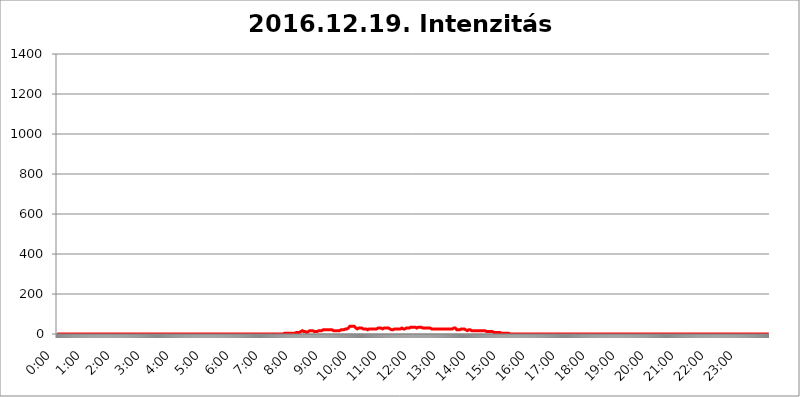
| Category | 2016.12.19. Intenzitás [W/m^2] |
|---|---|
| 0.0 | 0 |
| 0.0006944444444444445 | 0 |
| 0.001388888888888889 | 0 |
| 0.0020833333333333333 | 0 |
| 0.002777777777777778 | 0 |
| 0.003472222222222222 | 0 |
| 0.004166666666666667 | 0 |
| 0.004861111111111111 | 0 |
| 0.005555555555555556 | 0 |
| 0.0062499999999999995 | 0 |
| 0.006944444444444444 | 0 |
| 0.007638888888888889 | 0 |
| 0.008333333333333333 | 0 |
| 0.009027777777777779 | 0 |
| 0.009722222222222222 | 0 |
| 0.010416666666666666 | 0 |
| 0.011111111111111112 | 0 |
| 0.011805555555555555 | 0 |
| 0.012499999999999999 | 0 |
| 0.013194444444444444 | 0 |
| 0.013888888888888888 | 0 |
| 0.014583333333333332 | 0 |
| 0.015277777777777777 | 0 |
| 0.015972222222222224 | 0 |
| 0.016666666666666666 | 0 |
| 0.017361111111111112 | 0 |
| 0.018055555555555557 | 0 |
| 0.01875 | 0 |
| 0.019444444444444445 | 0 |
| 0.02013888888888889 | 0 |
| 0.020833333333333332 | 0 |
| 0.02152777777777778 | 0 |
| 0.022222222222222223 | 0 |
| 0.02291666666666667 | 0 |
| 0.02361111111111111 | 0 |
| 0.024305555555555556 | 0 |
| 0.024999999999999998 | 0 |
| 0.025694444444444447 | 0 |
| 0.02638888888888889 | 0 |
| 0.027083333333333334 | 0 |
| 0.027777777777777776 | 0 |
| 0.02847222222222222 | 0 |
| 0.029166666666666664 | 0 |
| 0.029861111111111113 | 0 |
| 0.030555555555555555 | 0 |
| 0.03125 | 0 |
| 0.03194444444444445 | 0 |
| 0.03263888888888889 | 0 |
| 0.03333333333333333 | 0 |
| 0.034027777777777775 | 0 |
| 0.034722222222222224 | 0 |
| 0.035416666666666666 | 0 |
| 0.036111111111111115 | 0 |
| 0.03680555555555556 | 0 |
| 0.0375 | 0 |
| 0.03819444444444444 | 0 |
| 0.03888888888888889 | 0 |
| 0.03958333333333333 | 0 |
| 0.04027777777777778 | 0 |
| 0.04097222222222222 | 0 |
| 0.041666666666666664 | 0 |
| 0.042361111111111106 | 0 |
| 0.04305555555555556 | 0 |
| 0.043750000000000004 | 0 |
| 0.044444444444444446 | 0 |
| 0.04513888888888889 | 0 |
| 0.04583333333333334 | 0 |
| 0.04652777777777778 | 0 |
| 0.04722222222222222 | 0 |
| 0.04791666666666666 | 0 |
| 0.04861111111111111 | 0 |
| 0.049305555555555554 | 0 |
| 0.049999999999999996 | 0 |
| 0.05069444444444445 | 0 |
| 0.051388888888888894 | 0 |
| 0.052083333333333336 | 0 |
| 0.05277777777777778 | 0 |
| 0.05347222222222222 | 0 |
| 0.05416666666666667 | 0 |
| 0.05486111111111111 | 0 |
| 0.05555555555555555 | 0 |
| 0.05625 | 0 |
| 0.05694444444444444 | 0 |
| 0.057638888888888885 | 0 |
| 0.05833333333333333 | 0 |
| 0.05902777777777778 | 0 |
| 0.059722222222222225 | 0 |
| 0.06041666666666667 | 0 |
| 0.061111111111111116 | 0 |
| 0.06180555555555556 | 0 |
| 0.0625 | 0 |
| 0.06319444444444444 | 0 |
| 0.06388888888888888 | 0 |
| 0.06458333333333334 | 0 |
| 0.06527777777777778 | 0 |
| 0.06597222222222222 | 0 |
| 0.06666666666666667 | 0 |
| 0.06736111111111111 | 0 |
| 0.06805555555555555 | 0 |
| 0.06874999999999999 | 0 |
| 0.06944444444444443 | 0 |
| 0.07013888888888889 | 0 |
| 0.07083333333333333 | 0 |
| 0.07152777777777779 | 0 |
| 0.07222222222222223 | 0 |
| 0.07291666666666667 | 0 |
| 0.07361111111111111 | 0 |
| 0.07430555555555556 | 0 |
| 0.075 | 0 |
| 0.07569444444444444 | 0 |
| 0.0763888888888889 | 0 |
| 0.07708333333333334 | 0 |
| 0.07777777777777778 | 0 |
| 0.07847222222222222 | 0 |
| 0.07916666666666666 | 0 |
| 0.0798611111111111 | 0 |
| 0.08055555555555556 | 0 |
| 0.08125 | 0 |
| 0.08194444444444444 | 0 |
| 0.08263888888888889 | 0 |
| 0.08333333333333333 | 0 |
| 0.08402777777777777 | 0 |
| 0.08472222222222221 | 0 |
| 0.08541666666666665 | 0 |
| 0.08611111111111112 | 0 |
| 0.08680555555555557 | 0 |
| 0.08750000000000001 | 0 |
| 0.08819444444444445 | 0 |
| 0.08888888888888889 | 0 |
| 0.08958333333333333 | 0 |
| 0.09027777777777778 | 0 |
| 0.09097222222222222 | 0 |
| 0.09166666666666667 | 0 |
| 0.09236111111111112 | 0 |
| 0.09305555555555556 | 0 |
| 0.09375 | 0 |
| 0.09444444444444444 | 0 |
| 0.09513888888888888 | 0 |
| 0.09583333333333333 | 0 |
| 0.09652777777777777 | 0 |
| 0.09722222222222222 | 0 |
| 0.09791666666666667 | 0 |
| 0.09861111111111111 | 0 |
| 0.09930555555555555 | 0 |
| 0.09999999999999999 | 0 |
| 0.10069444444444443 | 0 |
| 0.1013888888888889 | 0 |
| 0.10208333333333335 | 0 |
| 0.10277777777777779 | 0 |
| 0.10347222222222223 | 0 |
| 0.10416666666666667 | 0 |
| 0.10486111111111111 | 0 |
| 0.10555555555555556 | 0 |
| 0.10625 | 0 |
| 0.10694444444444444 | 0 |
| 0.1076388888888889 | 0 |
| 0.10833333333333334 | 0 |
| 0.10902777777777778 | 0 |
| 0.10972222222222222 | 0 |
| 0.1111111111111111 | 0 |
| 0.11180555555555556 | 0 |
| 0.11180555555555556 | 0 |
| 0.1125 | 0 |
| 0.11319444444444444 | 0 |
| 0.11388888888888889 | 0 |
| 0.11458333333333333 | 0 |
| 0.11527777777777777 | 0 |
| 0.11597222222222221 | 0 |
| 0.11666666666666665 | 0 |
| 0.1173611111111111 | 0 |
| 0.11805555555555557 | 0 |
| 0.11944444444444445 | 0 |
| 0.12013888888888889 | 0 |
| 0.12083333333333333 | 0 |
| 0.12152777777777778 | 0 |
| 0.12222222222222223 | 0 |
| 0.12291666666666667 | 0 |
| 0.12291666666666667 | 0 |
| 0.12361111111111112 | 0 |
| 0.12430555555555556 | 0 |
| 0.125 | 0 |
| 0.12569444444444444 | 0 |
| 0.12638888888888888 | 0 |
| 0.12708333333333333 | 0 |
| 0.16875 | 0 |
| 0.12847222222222224 | 0 |
| 0.12916666666666668 | 0 |
| 0.12986111111111112 | 0 |
| 0.13055555555555556 | 0 |
| 0.13125 | 0 |
| 0.13194444444444445 | 0 |
| 0.1326388888888889 | 0 |
| 0.13333333333333333 | 0 |
| 0.13402777777777777 | 0 |
| 0.13402777777777777 | 0 |
| 0.13472222222222222 | 0 |
| 0.13541666666666666 | 0 |
| 0.1361111111111111 | 0 |
| 0.13749999999999998 | 0 |
| 0.13819444444444443 | 0 |
| 0.1388888888888889 | 0 |
| 0.13958333333333334 | 0 |
| 0.14027777777777778 | 0 |
| 0.14097222222222222 | 0 |
| 0.14166666666666666 | 0 |
| 0.1423611111111111 | 0 |
| 0.14305555555555557 | 0 |
| 0.14375000000000002 | 0 |
| 0.14444444444444446 | 0 |
| 0.1451388888888889 | 0 |
| 0.1451388888888889 | 0 |
| 0.14652777777777778 | 0 |
| 0.14722222222222223 | 0 |
| 0.14791666666666667 | 0 |
| 0.1486111111111111 | 0 |
| 0.14930555555555555 | 0 |
| 0.15 | 0 |
| 0.15069444444444444 | 0 |
| 0.15138888888888888 | 0 |
| 0.15208333333333332 | 0 |
| 0.15277777777777776 | 0 |
| 0.15347222222222223 | 0 |
| 0.15416666666666667 | 0 |
| 0.15486111111111112 | 0 |
| 0.15555555555555556 | 0 |
| 0.15625 | 0 |
| 0.15694444444444444 | 0 |
| 0.15763888888888888 | 0 |
| 0.15833333333333333 | 0 |
| 0.15902777777777777 | 0 |
| 0.15972222222222224 | 0 |
| 0.16041666666666668 | 0 |
| 0.16111111111111112 | 0 |
| 0.16180555555555556 | 0 |
| 0.1625 | 0 |
| 0.16319444444444445 | 0 |
| 0.1638888888888889 | 0 |
| 0.16458333333333333 | 0 |
| 0.16527777777777777 | 0 |
| 0.16597222222222222 | 0 |
| 0.16666666666666666 | 0 |
| 0.1673611111111111 | 0 |
| 0.16805555555555554 | 0 |
| 0.16874999999999998 | 0 |
| 0.16944444444444443 | 0 |
| 0.17013888888888887 | 0 |
| 0.1708333333333333 | 0 |
| 0.17152777777777775 | 0 |
| 0.17222222222222225 | 0 |
| 0.1729166666666667 | 0 |
| 0.17361111111111113 | 0 |
| 0.17430555555555557 | 0 |
| 0.17500000000000002 | 0 |
| 0.17569444444444446 | 0 |
| 0.1763888888888889 | 0 |
| 0.17708333333333334 | 0 |
| 0.17777777777777778 | 0 |
| 0.17847222222222223 | 0 |
| 0.17916666666666667 | 0 |
| 0.1798611111111111 | 0 |
| 0.18055555555555555 | 0 |
| 0.18125 | 0 |
| 0.18194444444444444 | 0 |
| 0.1826388888888889 | 0 |
| 0.18333333333333335 | 0 |
| 0.1840277777777778 | 0 |
| 0.18472222222222223 | 0 |
| 0.18541666666666667 | 0 |
| 0.18611111111111112 | 0 |
| 0.18680555555555556 | 0 |
| 0.1875 | 0 |
| 0.18819444444444444 | 0 |
| 0.18888888888888888 | 0 |
| 0.18958333333333333 | 0 |
| 0.19027777777777777 | 0 |
| 0.1909722222222222 | 0 |
| 0.19166666666666665 | 0 |
| 0.19236111111111112 | 0 |
| 0.19305555555555554 | 0 |
| 0.19375 | 0 |
| 0.19444444444444445 | 0 |
| 0.1951388888888889 | 0 |
| 0.19583333333333333 | 0 |
| 0.19652777777777777 | 0 |
| 0.19722222222222222 | 0 |
| 0.19791666666666666 | 0 |
| 0.1986111111111111 | 0 |
| 0.19930555555555554 | 0 |
| 0.19999999999999998 | 0 |
| 0.20069444444444443 | 0 |
| 0.20138888888888887 | 0 |
| 0.2020833333333333 | 0 |
| 0.2027777777777778 | 0 |
| 0.2034722222222222 | 0 |
| 0.2041666666666667 | 0 |
| 0.20486111111111113 | 0 |
| 0.20555555555555557 | 0 |
| 0.20625000000000002 | 0 |
| 0.20694444444444446 | 0 |
| 0.2076388888888889 | 0 |
| 0.20833333333333334 | 0 |
| 0.20902777777777778 | 0 |
| 0.20972222222222223 | 0 |
| 0.21041666666666667 | 0 |
| 0.2111111111111111 | 0 |
| 0.21180555555555555 | 0 |
| 0.2125 | 0 |
| 0.21319444444444444 | 0 |
| 0.2138888888888889 | 0 |
| 0.21458333333333335 | 0 |
| 0.2152777777777778 | 0 |
| 0.21597222222222223 | 0 |
| 0.21666666666666667 | 0 |
| 0.21736111111111112 | 0 |
| 0.21805555555555556 | 0 |
| 0.21875 | 0 |
| 0.21944444444444444 | 0 |
| 0.22013888888888888 | 0 |
| 0.22083333333333333 | 0 |
| 0.22152777777777777 | 0 |
| 0.2222222222222222 | 0 |
| 0.22291666666666665 | 0 |
| 0.2236111111111111 | 0 |
| 0.22430555555555556 | 0 |
| 0.225 | 0 |
| 0.22569444444444445 | 0 |
| 0.2263888888888889 | 0 |
| 0.22708333333333333 | 0 |
| 0.22777777777777777 | 0 |
| 0.22847222222222222 | 0 |
| 0.22916666666666666 | 0 |
| 0.2298611111111111 | 0 |
| 0.23055555555555554 | 0 |
| 0.23124999999999998 | 0 |
| 0.23194444444444443 | 0 |
| 0.23263888888888887 | 0 |
| 0.2333333333333333 | 0 |
| 0.2340277777777778 | 0 |
| 0.2347222222222222 | 0 |
| 0.2354166666666667 | 0 |
| 0.23611111111111113 | 0 |
| 0.23680555555555557 | 0 |
| 0.23750000000000002 | 0 |
| 0.23819444444444446 | 0 |
| 0.2388888888888889 | 0 |
| 0.23958333333333334 | 0 |
| 0.24027777777777778 | 0 |
| 0.24097222222222223 | 0 |
| 0.24166666666666667 | 0 |
| 0.2423611111111111 | 0 |
| 0.24305555555555555 | 0 |
| 0.24375 | 0 |
| 0.24444444444444446 | 0 |
| 0.24513888888888888 | 0 |
| 0.24583333333333335 | 0 |
| 0.2465277777777778 | 0 |
| 0.24722222222222223 | 0 |
| 0.24791666666666667 | 0 |
| 0.24861111111111112 | 0 |
| 0.24930555555555556 | 0 |
| 0.25 | 0 |
| 0.25069444444444444 | 0 |
| 0.2513888888888889 | 0 |
| 0.2520833333333333 | 0 |
| 0.25277777777777777 | 0 |
| 0.2534722222222222 | 0 |
| 0.25416666666666665 | 0 |
| 0.2548611111111111 | 0 |
| 0.2555555555555556 | 0 |
| 0.25625000000000003 | 0 |
| 0.2569444444444445 | 0 |
| 0.2576388888888889 | 0 |
| 0.25833333333333336 | 0 |
| 0.2590277777777778 | 0 |
| 0.25972222222222224 | 0 |
| 0.2604166666666667 | 0 |
| 0.2611111111111111 | 0 |
| 0.26180555555555557 | 0 |
| 0.2625 | 0 |
| 0.26319444444444445 | 0 |
| 0.2638888888888889 | 0 |
| 0.26458333333333334 | 0 |
| 0.2652777777777778 | 0 |
| 0.2659722222222222 | 0 |
| 0.26666666666666666 | 0 |
| 0.2673611111111111 | 0 |
| 0.26805555555555555 | 0 |
| 0.26875 | 0 |
| 0.26944444444444443 | 0 |
| 0.2701388888888889 | 0 |
| 0.2708333333333333 | 0 |
| 0.27152777777777776 | 0 |
| 0.2722222222222222 | 0 |
| 0.27291666666666664 | 0 |
| 0.2736111111111111 | 0 |
| 0.2743055555555555 | 0 |
| 0.27499999999999997 | 0 |
| 0.27569444444444446 | 0 |
| 0.27638888888888885 | 0 |
| 0.27708333333333335 | 0 |
| 0.2777777777777778 | 0 |
| 0.27847222222222223 | 0 |
| 0.2791666666666667 | 0 |
| 0.2798611111111111 | 0 |
| 0.28055555555555556 | 0 |
| 0.28125 | 0 |
| 0.28194444444444444 | 0 |
| 0.2826388888888889 | 0 |
| 0.2833333333333333 | 0 |
| 0.28402777777777777 | 0 |
| 0.2847222222222222 | 0 |
| 0.28541666666666665 | 0 |
| 0.28611111111111115 | 0 |
| 0.28680555555555554 | 0 |
| 0.28750000000000003 | 0 |
| 0.2881944444444445 | 0 |
| 0.2888888888888889 | 0 |
| 0.28958333333333336 | 0 |
| 0.2902777777777778 | 0 |
| 0.29097222222222224 | 0 |
| 0.2916666666666667 | 0 |
| 0.2923611111111111 | 0 |
| 0.29305555555555557 | 0 |
| 0.29375 | 0 |
| 0.29444444444444445 | 0 |
| 0.2951388888888889 | 0 |
| 0.29583333333333334 | 0 |
| 0.2965277777777778 | 0 |
| 0.2972222222222222 | 0 |
| 0.29791666666666666 | 0 |
| 0.2986111111111111 | 0 |
| 0.29930555555555555 | 0 |
| 0.3 | 0 |
| 0.30069444444444443 | 0 |
| 0.3013888888888889 | 0 |
| 0.3020833333333333 | 0 |
| 0.30277777777777776 | 0 |
| 0.3034722222222222 | 0 |
| 0.30416666666666664 | 0 |
| 0.3048611111111111 | 0 |
| 0.3055555555555555 | 0 |
| 0.30624999999999997 | 0 |
| 0.3069444444444444 | 0 |
| 0.3076388888888889 | 0 |
| 0.30833333333333335 | 0 |
| 0.3090277777777778 | 0 |
| 0.30972222222222223 | 0 |
| 0.3104166666666667 | 0 |
| 0.3111111111111111 | 0 |
| 0.31180555555555556 | 0 |
| 0.3125 | 0 |
| 0.31319444444444444 | 0 |
| 0.3138888888888889 | 0 |
| 0.3145833333333333 | 0 |
| 0.31527777777777777 | 0 |
| 0.3159722222222222 | 0 |
| 0.31666666666666665 | 0 |
| 0.31736111111111115 | 0 |
| 0.31805555555555554 | 0 |
| 0.31875000000000003 | 3.525 |
| 0.3194444444444445 | 3.525 |
| 0.3201388888888889 | 3.525 |
| 0.32083333333333336 | 3.525 |
| 0.3215277777777778 | 3.525 |
| 0.32222222222222224 | 3.525 |
| 0.3229166666666667 | 3.525 |
| 0.3236111111111111 | 3.525 |
| 0.32430555555555557 | 3.525 |
| 0.325 | 3.525 |
| 0.32569444444444445 | 3.525 |
| 0.3263888888888889 | 3.525 |
| 0.32708333333333334 | 3.525 |
| 0.3277777777777778 | 3.525 |
| 0.3284722222222222 | 3.525 |
| 0.32916666666666666 | 3.525 |
| 0.3298611111111111 | 3.525 |
| 0.33055555555555555 | 3.525 |
| 0.33125 | 3.525 |
| 0.33194444444444443 | 3.525 |
| 0.3326388888888889 | 3.525 |
| 0.3333333333333333 | 3.525 |
| 0.3340277777777778 | 3.525 |
| 0.3347222222222222 | 3.525 |
| 0.3354166666666667 | 7.887 |
| 0.3361111111111111 | 7.887 |
| 0.3368055555555556 | 7.887 |
| 0.33749999999999997 | 7.887 |
| 0.33819444444444446 | 7.887 |
| 0.33888888888888885 | 7.887 |
| 0.33958333333333335 | 7.887 |
| 0.34027777777777773 | 7.887 |
| 0.34097222222222223 | 12.257 |
| 0.3416666666666666 | 12.257 |
| 0.3423611111111111 | 12.257 |
| 0.3430555555555555 | 12.257 |
| 0.34375 | 16.636 |
| 0.3444444444444445 | 12.257 |
| 0.3451388888888889 | 12.257 |
| 0.3458333333333334 | 12.257 |
| 0.34652777777777777 | 12.257 |
| 0.34722222222222227 | 12.257 |
| 0.34791666666666665 | 12.257 |
| 0.34861111111111115 | 12.257 |
| 0.34930555555555554 | 12.257 |
| 0.35000000000000003 | 7.887 |
| 0.3506944444444444 | 12.257 |
| 0.3513888888888889 | 12.257 |
| 0.3520833333333333 | 12.257 |
| 0.3527777777777778 | 12.257 |
| 0.3534722222222222 | 16.636 |
| 0.3541666666666667 | 16.636 |
| 0.3548611111111111 | 16.636 |
| 0.35555555555555557 | 16.636 |
| 0.35625 | 16.636 |
| 0.35694444444444445 | 16.636 |
| 0.3576388888888889 | 16.636 |
| 0.35833333333333334 | 16.636 |
| 0.3590277777777778 | 12.257 |
| 0.3597222222222222 | 12.257 |
| 0.36041666666666666 | 12.257 |
| 0.3611111111111111 | 12.257 |
| 0.36180555555555555 | 12.257 |
| 0.3625 | 12.257 |
| 0.36319444444444443 | 12.257 |
| 0.3638888888888889 | 12.257 |
| 0.3645833333333333 | 12.257 |
| 0.3652777777777778 | 12.257 |
| 0.3659722222222222 | 12.257 |
| 0.3666666666666667 | 16.636 |
| 0.3673611111111111 | 16.636 |
| 0.3680555555555556 | 16.636 |
| 0.36874999999999997 | 16.636 |
| 0.36944444444444446 | 16.636 |
| 0.37013888888888885 | 16.636 |
| 0.37083333333333335 | 16.636 |
| 0.37152777777777773 | 16.636 |
| 0.37222222222222223 | 21.024 |
| 0.3729166666666666 | 21.024 |
| 0.3736111111111111 | 16.636 |
| 0.3743055555555555 | 21.024 |
| 0.375 | 21.024 |
| 0.3756944444444445 | 21.024 |
| 0.3763888888888889 | 21.024 |
| 0.3770833333333334 | 21.024 |
| 0.37777777777777777 | 21.024 |
| 0.37847222222222227 | 21.024 |
| 0.37916666666666665 | 21.024 |
| 0.37986111111111115 | 21.024 |
| 0.38055555555555554 | 21.024 |
| 0.38125000000000003 | 21.024 |
| 0.3819444444444444 | 21.024 |
| 0.3826388888888889 | 21.024 |
| 0.3833333333333333 | 21.024 |
| 0.3840277777777778 | 21.024 |
| 0.3847222222222222 | 21.024 |
| 0.3854166666666667 | 21.024 |
| 0.3861111111111111 | 21.024 |
| 0.38680555555555557 | 16.636 |
| 0.3875 | 16.636 |
| 0.38819444444444445 | 16.636 |
| 0.3888888888888889 | 16.636 |
| 0.38958333333333334 | 16.636 |
| 0.3902777777777778 | 21.024 |
| 0.3909722222222222 | 21.024 |
| 0.39166666666666666 | 16.636 |
| 0.3923611111111111 | 16.636 |
| 0.39305555555555555 | 16.636 |
| 0.39375 | 16.636 |
| 0.39444444444444443 | 16.636 |
| 0.3951388888888889 | 16.636 |
| 0.3958333333333333 | 16.636 |
| 0.3965277777777778 | 16.636 |
| 0.3972222222222222 | 21.024 |
| 0.3979166666666667 | 21.024 |
| 0.3986111111111111 | 21.024 |
| 0.3993055555555556 | 21.024 |
| 0.39999999999999997 | 21.024 |
| 0.40069444444444446 | 21.024 |
| 0.40138888888888885 | 21.024 |
| 0.40208333333333335 | 21.024 |
| 0.40277777777777773 | 21.024 |
| 0.40347222222222223 | 25.419 |
| 0.4041666666666666 | 25.419 |
| 0.4048611111111111 | 25.419 |
| 0.4055555555555555 | 25.419 |
| 0.40625 | 25.419 |
| 0.4069444444444445 | 25.419 |
| 0.4076388888888889 | 29.823 |
| 0.4083333333333334 | 29.823 |
| 0.40902777777777777 | 34.234 |
| 0.40972222222222227 | 34.234 |
| 0.41041666666666665 | 38.653 |
| 0.41111111111111115 | 38.653 |
| 0.41180555555555554 | 38.653 |
| 0.41250000000000003 | 38.653 |
| 0.4131944444444444 | 38.653 |
| 0.4138888888888889 | 38.653 |
| 0.4145833333333333 | 38.653 |
| 0.4152777777777778 | 38.653 |
| 0.4159722222222222 | 38.653 |
| 0.4166666666666667 | 38.653 |
| 0.4173611111111111 | 34.234 |
| 0.41805555555555557 | 34.234 |
| 0.41875 | 29.823 |
| 0.41944444444444445 | 29.823 |
| 0.4201388888888889 | 29.823 |
| 0.42083333333333334 | 25.419 |
| 0.4215277777777778 | 29.823 |
| 0.4222222222222222 | 29.823 |
| 0.42291666666666666 | 29.823 |
| 0.4236111111111111 | 29.823 |
| 0.42430555555555555 | 29.823 |
| 0.425 | 29.823 |
| 0.42569444444444443 | 29.823 |
| 0.4263888888888889 | 29.823 |
| 0.4270833333333333 | 29.823 |
| 0.4277777777777778 | 29.823 |
| 0.4284722222222222 | 25.419 |
| 0.4291666666666667 | 25.419 |
| 0.4298611111111111 | 25.419 |
| 0.4305555555555556 | 25.419 |
| 0.43124999999999997 | 25.419 |
| 0.43194444444444446 | 25.419 |
| 0.43263888888888885 | 25.419 |
| 0.43333333333333335 | 25.419 |
| 0.43402777777777773 | 25.419 |
| 0.43472222222222223 | 21.024 |
| 0.4354166666666666 | 21.024 |
| 0.4361111111111111 | 21.024 |
| 0.4368055555555555 | 25.419 |
| 0.4375 | 25.419 |
| 0.4381944444444445 | 25.419 |
| 0.4388888888888889 | 25.419 |
| 0.4395833333333334 | 25.419 |
| 0.44027777777777777 | 25.419 |
| 0.44097222222222227 | 25.419 |
| 0.44166666666666665 | 25.419 |
| 0.44236111111111115 | 25.419 |
| 0.44305555555555554 | 25.419 |
| 0.44375000000000003 | 25.419 |
| 0.4444444444444444 | 25.419 |
| 0.4451388888888889 | 25.419 |
| 0.4458333333333333 | 25.419 |
| 0.4465277777777778 | 25.419 |
| 0.4472222222222222 | 25.419 |
| 0.4479166666666667 | 25.419 |
| 0.4486111111111111 | 25.419 |
| 0.44930555555555557 | 29.823 |
| 0.45 | 29.823 |
| 0.45069444444444445 | 25.419 |
| 0.4513888888888889 | 29.823 |
| 0.45208333333333334 | 29.823 |
| 0.4527777777777778 | 29.823 |
| 0.4534722222222222 | 29.823 |
| 0.45416666666666666 | 29.823 |
| 0.4548611111111111 | 29.823 |
| 0.45555555555555555 | 25.419 |
| 0.45625 | 25.419 |
| 0.45694444444444443 | 25.419 |
| 0.4576388888888889 | 25.419 |
| 0.4583333333333333 | 29.823 |
| 0.4590277777777778 | 29.823 |
| 0.4597222222222222 | 29.823 |
| 0.4604166666666667 | 29.823 |
| 0.4611111111111111 | 34.234 |
| 0.4618055555555556 | 29.823 |
| 0.46249999999999997 | 29.823 |
| 0.46319444444444446 | 29.823 |
| 0.46388888888888885 | 29.823 |
| 0.46458333333333335 | 29.823 |
| 0.46527777777777773 | 25.419 |
| 0.46597222222222223 | 25.419 |
| 0.4666666666666666 | 25.419 |
| 0.4673611111111111 | 25.419 |
| 0.4680555555555555 | 25.419 |
| 0.46875 | 21.024 |
| 0.4694444444444445 | 25.419 |
| 0.4701388888888889 | 25.419 |
| 0.4708333333333334 | 21.024 |
| 0.47152777777777777 | 25.419 |
| 0.47222222222222227 | 25.419 |
| 0.47291666666666665 | 25.419 |
| 0.47361111111111115 | 25.419 |
| 0.47430555555555554 | 25.419 |
| 0.47500000000000003 | 25.419 |
| 0.4756944444444444 | 25.419 |
| 0.4763888888888889 | 25.419 |
| 0.4770833333333333 | 25.419 |
| 0.4777777777777778 | 25.419 |
| 0.4784722222222222 | 25.419 |
| 0.4791666666666667 | 25.419 |
| 0.4798611111111111 | 25.419 |
| 0.48055555555555557 | 25.419 |
| 0.48125 | 25.419 |
| 0.48194444444444445 | 25.419 |
| 0.4826388888888889 | 29.823 |
| 0.48333333333333334 | 29.823 |
| 0.4840277777777778 | 25.419 |
| 0.4847222222222222 | 25.419 |
| 0.48541666666666666 | 25.419 |
| 0.4861111111111111 | 25.419 |
| 0.48680555555555555 | 25.419 |
| 0.4875 | 25.419 |
| 0.48819444444444443 | 25.419 |
| 0.4888888888888889 | 29.823 |
| 0.4895833333333333 | 29.823 |
| 0.4902777777777778 | 29.823 |
| 0.4909722222222222 | 29.823 |
| 0.4916666666666667 | 29.823 |
| 0.4923611111111111 | 29.823 |
| 0.4930555555555556 | 29.823 |
| 0.49374999999999997 | 29.823 |
| 0.49444444444444446 | 34.234 |
| 0.49513888888888885 | 34.234 |
| 0.49583333333333335 | 34.234 |
| 0.49652777777777773 | 34.234 |
| 0.49722222222222223 | 34.234 |
| 0.4979166666666666 | 34.234 |
| 0.4986111111111111 | 38.653 |
| 0.4993055555555555 | 34.234 |
| 0.5 | 34.234 |
| 0.5006944444444444 | 34.234 |
| 0.5013888888888889 | 34.234 |
| 0.5020833333333333 | 34.234 |
| 0.5027777777777778 | 34.234 |
| 0.5034722222222222 | 34.234 |
| 0.5041666666666667 | 29.823 |
| 0.5048611111111111 | 29.823 |
| 0.5055555555555555 | 29.823 |
| 0.50625 | 34.234 |
| 0.5069444444444444 | 34.234 |
| 0.5076388888888889 | 34.234 |
| 0.5083333333333333 | 34.234 |
| 0.5090277777777777 | 29.823 |
| 0.5097222222222222 | 29.823 |
| 0.5104166666666666 | 34.234 |
| 0.5111111111111112 | 34.234 |
| 0.5118055555555555 | 29.823 |
| 0.5125000000000001 | 29.823 |
| 0.5131944444444444 | 29.823 |
| 0.513888888888889 | 29.823 |
| 0.5145833333333333 | 29.823 |
| 0.5152777777777778 | 29.823 |
| 0.5159722222222222 | 29.823 |
| 0.5166666666666667 | 29.823 |
| 0.517361111111111 | 29.823 |
| 0.5180555555555556 | 29.823 |
| 0.5187499999999999 | 29.823 |
| 0.5194444444444445 | 29.823 |
| 0.5201388888888888 | 29.823 |
| 0.5208333333333334 | 29.823 |
| 0.5215277777777778 | 29.823 |
| 0.5222222222222223 | 29.823 |
| 0.5229166666666667 | 29.823 |
| 0.5236111111111111 | 29.823 |
| 0.5243055555555556 | 25.419 |
| 0.525 | 25.419 |
| 0.5256944444444445 | 25.419 |
| 0.5263888888888889 | 25.419 |
| 0.5270833333333333 | 25.419 |
| 0.5277777777777778 | 25.419 |
| 0.5284722222222222 | 25.419 |
| 0.5291666666666667 | 25.419 |
| 0.5298611111111111 | 29.823 |
| 0.5305555555555556 | 29.823 |
| 0.53125 | 25.419 |
| 0.5319444444444444 | 25.419 |
| 0.5326388888888889 | 25.419 |
| 0.5333333333333333 | 25.419 |
| 0.5340277777777778 | 25.419 |
| 0.5347222222222222 | 25.419 |
| 0.5354166666666667 | 25.419 |
| 0.5361111111111111 | 25.419 |
| 0.5368055555555555 | 25.419 |
| 0.5375 | 25.419 |
| 0.5381944444444444 | 25.419 |
| 0.5388888888888889 | 25.419 |
| 0.5395833333333333 | 25.419 |
| 0.5402777777777777 | 25.419 |
| 0.5409722222222222 | 25.419 |
| 0.5416666666666666 | 25.419 |
| 0.5423611111111112 | 25.419 |
| 0.5430555555555555 | 25.419 |
| 0.5437500000000001 | 25.419 |
| 0.5444444444444444 | 25.419 |
| 0.545138888888889 | 25.419 |
| 0.5458333333333333 | 25.419 |
| 0.5465277777777778 | 29.823 |
| 0.5472222222222222 | 29.823 |
| 0.5479166666666667 | 25.419 |
| 0.548611111111111 | 25.419 |
| 0.5493055555555556 | 25.419 |
| 0.5499999999999999 | 25.419 |
| 0.5506944444444445 | 25.419 |
| 0.5513888888888888 | 25.419 |
| 0.5520833333333334 | 25.419 |
| 0.5527777777777778 | 25.419 |
| 0.5534722222222223 | 25.419 |
| 0.5541666666666667 | 25.419 |
| 0.5548611111111111 | 29.823 |
| 0.5555555555555556 | 29.823 |
| 0.55625 | 29.823 |
| 0.5569444444444445 | 29.823 |
| 0.5576388888888889 | 29.823 |
| 0.5583333333333333 | 29.823 |
| 0.5590277777777778 | 25.419 |
| 0.5597222222222222 | 25.419 |
| 0.5604166666666667 | 21.024 |
| 0.5611111111111111 | 21.024 |
| 0.5618055555555556 | 21.024 |
| 0.5625 | 21.024 |
| 0.5631944444444444 | 21.024 |
| 0.5638888888888889 | 21.024 |
| 0.5645833333333333 | 21.024 |
| 0.5652777777777778 | 21.024 |
| 0.5659722222222222 | 25.419 |
| 0.5666666666666667 | 25.419 |
| 0.5673611111111111 | 25.419 |
| 0.5680555555555555 | 25.419 |
| 0.56875 | 25.419 |
| 0.5694444444444444 | 25.419 |
| 0.5701388888888889 | 25.419 |
| 0.5708333333333333 | 25.419 |
| 0.5715277777777777 | 21.024 |
| 0.5722222222222222 | 21.024 |
| 0.5729166666666666 | 21.024 |
| 0.5736111111111112 | 21.024 |
| 0.5743055555555555 | 21.024 |
| 0.5750000000000001 | 16.636 |
| 0.5756944444444444 | 16.636 |
| 0.576388888888889 | 16.636 |
| 0.5770833333333333 | 21.024 |
| 0.5777777777777778 | 21.024 |
| 0.5784722222222222 | 21.024 |
| 0.5791666666666667 | 21.024 |
| 0.579861111111111 | 21.024 |
| 0.5805555555555556 | 21.024 |
| 0.5812499999999999 | 16.636 |
| 0.5819444444444445 | 16.636 |
| 0.5826388888888888 | 16.636 |
| 0.5833333333333334 | 16.636 |
| 0.5840277777777778 | 16.636 |
| 0.5847222222222223 | 16.636 |
| 0.5854166666666667 | 16.636 |
| 0.5861111111111111 | 16.636 |
| 0.5868055555555556 | 16.636 |
| 0.5875 | 16.636 |
| 0.5881944444444445 | 16.636 |
| 0.5888888888888889 | 16.636 |
| 0.5895833333333333 | 16.636 |
| 0.5902777777777778 | 16.636 |
| 0.5909722222222222 | 16.636 |
| 0.5916666666666667 | 16.636 |
| 0.5923611111111111 | 12.257 |
| 0.5930555555555556 | 16.636 |
| 0.59375 | 16.636 |
| 0.5944444444444444 | 16.636 |
| 0.5951388888888889 | 16.636 |
| 0.5958333333333333 | 16.636 |
| 0.5965277777777778 | 16.636 |
| 0.5972222222222222 | 16.636 |
| 0.5979166666666667 | 16.636 |
| 0.5986111111111111 | 16.636 |
| 0.5993055555555555 | 16.636 |
| 0.6 | 16.636 |
| 0.6006944444444444 | 12.257 |
| 0.6013888888888889 | 12.257 |
| 0.6020833333333333 | 12.257 |
| 0.6027777777777777 | 12.257 |
| 0.6034722222222222 | 12.257 |
| 0.6041666666666666 | 12.257 |
| 0.6048611111111112 | 12.257 |
| 0.6055555555555555 | 12.257 |
| 0.6062500000000001 | 12.257 |
| 0.6069444444444444 | 12.257 |
| 0.607638888888889 | 12.257 |
| 0.6083333333333333 | 12.257 |
| 0.6090277777777778 | 12.257 |
| 0.6097222222222222 | 12.257 |
| 0.6104166666666667 | 12.257 |
| 0.611111111111111 | 7.887 |
| 0.6118055555555556 | 7.887 |
| 0.6124999999999999 | 7.887 |
| 0.6131944444444445 | 7.887 |
| 0.6138888888888888 | 7.887 |
| 0.6145833333333334 | 7.887 |
| 0.6152777777777778 | 7.887 |
| 0.6159722222222223 | 7.887 |
| 0.6166666666666667 | 7.887 |
| 0.6173611111111111 | 3.525 |
| 0.6180555555555556 | 7.887 |
| 0.61875 | 7.887 |
| 0.6194444444444445 | 7.887 |
| 0.6201388888888889 | 3.525 |
| 0.6208333333333333 | 7.887 |
| 0.6215277777777778 | 3.525 |
| 0.6222222222222222 | 3.525 |
| 0.6229166666666667 | 3.525 |
| 0.6236111111111111 | 3.525 |
| 0.6243055555555556 | 3.525 |
| 0.625 | 3.525 |
| 0.6256944444444444 | 3.525 |
| 0.6263888888888889 | 3.525 |
| 0.6270833333333333 | 3.525 |
| 0.6277777777777778 | 3.525 |
| 0.6284722222222222 | 3.525 |
| 0.6291666666666667 | 3.525 |
| 0.6298611111111111 | 3.525 |
| 0.6305555555555555 | 3.525 |
| 0.63125 | 3.525 |
| 0.6319444444444444 | 3.525 |
| 0.6326388888888889 | 3.525 |
| 0.6333333333333333 | 3.525 |
| 0.6340277777777777 | 0 |
| 0.6347222222222222 | 3.525 |
| 0.6354166666666666 | 0 |
| 0.6361111111111112 | 0 |
| 0.6368055555555555 | 0 |
| 0.6375000000000001 | 0 |
| 0.6381944444444444 | 0 |
| 0.638888888888889 | 0 |
| 0.6395833333333333 | 0 |
| 0.6402777777777778 | 0 |
| 0.6409722222222222 | 0 |
| 0.6416666666666667 | 0 |
| 0.642361111111111 | 0 |
| 0.6430555555555556 | 0 |
| 0.6437499999999999 | 0 |
| 0.6444444444444445 | 0 |
| 0.6451388888888888 | 0 |
| 0.6458333333333334 | 0 |
| 0.6465277777777778 | 0 |
| 0.6472222222222223 | 0 |
| 0.6479166666666667 | 0 |
| 0.6486111111111111 | 0 |
| 0.6493055555555556 | 0 |
| 0.65 | 0 |
| 0.6506944444444445 | 0 |
| 0.6513888888888889 | 0 |
| 0.6520833333333333 | 0 |
| 0.6527777777777778 | 0 |
| 0.6534722222222222 | 0 |
| 0.6541666666666667 | 0 |
| 0.6548611111111111 | 0 |
| 0.6555555555555556 | 0 |
| 0.65625 | 0 |
| 0.6569444444444444 | 0 |
| 0.6576388888888889 | 0 |
| 0.6583333333333333 | 0 |
| 0.6590277777777778 | 0 |
| 0.6597222222222222 | 0 |
| 0.6604166666666667 | 0 |
| 0.6611111111111111 | 0 |
| 0.6618055555555555 | 0 |
| 0.6625 | 0 |
| 0.6631944444444444 | 0 |
| 0.6638888888888889 | 0 |
| 0.6645833333333333 | 0 |
| 0.6652777777777777 | 0 |
| 0.6659722222222222 | 0 |
| 0.6666666666666666 | 0 |
| 0.6673611111111111 | 0 |
| 0.6680555555555556 | 0 |
| 0.6687500000000001 | 0 |
| 0.6694444444444444 | 0 |
| 0.6701388888888888 | 0 |
| 0.6708333333333334 | 0 |
| 0.6715277777777778 | 0 |
| 0.6722222222222222 | 0 |
| 0.6729166666666666 | 0 |
| 0.6736111111111112 | 0 |
| 0.6743055555555556 | 0 |
| 0.6749999999999999 | 0 |
| 0.6756944444444444 | 0 |
| 0.6763888888888889 | 0 |
| 0.6770833333333334 | 0 |
| 0.6777777777777777 | 0 |
| 0.6784722222222223 | 0 |
| 0.6791666666666667 | 0 |
| 0.6798611111111111 | 0 |
| 0.6805555555555555 | 0 |
| 0.68125 | 0 |
| 0.6819444444444445 | 0 |
| 0.6826388888888889 | 0 |
| 0.6833333333333332 | 0 |
| 0.6840277777777778 | 0 |
| 0.6847222222222222 | 0 |
| 0.6854166666666667 | 0 |
| 0.686111111111111 | 0 |
| 0.6868055555555556 | 0 |
| 0.6875 | 0 |
| 0.6881944444444444 | 0 |
| 0.688888888888889 | 0 |
| 0.6895833333333333 | 0 |
| 0.6902777777777778 | 0 |
| 0.6909722222222222 | 0 |
| 0.6916666666666668 | 0 |
| 0.6923611111111111 | 0 |
| 0.6930555555555555 | 0 |
| 0.69375 | 0 |
| 0.6944444444444445 | 0 |
| 0.6951388888888889 | 0 |
| 0.6958333333333333 | 0 |
| 0.6965277777777777 | 0 |
| 0.6972222222222223 | 0 |
| 0.6979166666666666 | 0 |
| 0.6986111111111111 | 0 |
| 0.6993055555555556 | 0 |
| 0.7000000000000001 | 0 |
| 0.7006944444444444 | 0 |
| 0.7013888888888888 | 0 |
| 0.7020833333333334 | 0 |
| 0.7027777777777778 | 0 |
| 0.7034722222222222 | 0 |
| 0.7041666666666666 | 0 |
| 0.7048611111111112 | 0 |
| 0.7055555555555556 | 0 |
| 0.7062499999999999 | 0 |
| 0.7069444444444444 | 0 |
| 0.7076388888888889 | 0 |
| 0.7083333333333334 | 0 |
| 0.7090277777777777 | 0 |
| 0.7097222222222223 | 0 |
| 0.7104166666666667 | 0 |
| 0.7111111111111111 | 0 |
| 0.7118055555555555 | 0 |
| 0.7125 | 0 |
| 0.7131944444444445 | 0 |
| 0.7138888888888889 | 0 |
| 0.7145833333333332 | 0 |
| 0.7152777777777778 | 0 |
| 0.7159722222222222 | 0 |
| 0.7166666666666667 | 0 |
| 0.717361111111111 | 0 |
| 0.7180555555555556 | 0 |
| 0.71875 | 0 |
| 0.7194444444444444 | 0 |
| 0.720138888888889 | 0 |
| 0.7208333333333333 | 0 |
| 0.7215277777777778 | 0 |
| 0.7222222222222222 | 0 |
| 0.7229166666666668 | 0 |
| 0.7236111111111111 | 0 |
| 0.7243055555555555 | 0 |
| 0.725 | 0 |
| 0.7256944444444445 | 0 |
| 0.7263888888888889 | 0 |
| 0.7270833333333333 | 0 |
| 0.7277777777777777 | 0 |
| 0.7284722222222223 | 0 |
| 0.7291666666666666 | 0 |
| 0.7298611111111111 | 0 |
| 0.7305555555555556 | 0 |
| 0.7312500000000001 | 0 |
| 0.7319444444444444 | 0 |
| 0.7326388888888888 | 0 |
| 0.7333333333333334 | 0 |
| 0.7340277777777778 | 0 |
| 0.7347222222222222 | 0 |
| 0.7354166666666666 | 0 |
| 0.7361111111111112 | 0 |
| 0.7368055555555556 | 0 |
| 0.7374999999999999 | 0 |
| 0.7381944444444444 | 0 |
| 0.7388888888888889 | 0 |
| 0.7395833333333334 | 0 |
| 0.7402777777777777 | 0 |
| 0.7409722222222223 | 0 |
| 0.7416666666666667 | 0 |
| 0.7423611111111111 | 0 |
| 0.7430555555555555 | 0 |
| 0.74375 | 0 |
| 0.7444444444444445 | 0 |
| 0.7451388888888889 | 0 |
| 0.7458333333333332 | 0 |
| 0.7465277777777778 | 0 |
| 0.7472222222222222 | 0 |
| 0.7479166666666667 | 0 |
| 0.748611111111111 | 0 |
| 0.7493055555555556 | 0 |
| 0.75 | 0 |
| 0.7506944444444444 | 0 |
| 0.751388888888889 | 0 |
| 0.7520833333333333 | 0 |
| 0.7527777777777778 | 0 |
| 0.7534722222222222 | 0 |
| 0.7541666666666668 | 0 |
| 0.7548611111111111 | 0 |
| 0.7555555555555555 | 0 |
| 0.75625 | 0 |
| 0.7569444444444445 | 0 |
| 0.7576388888888889 | 0 |
| 0.7583333333333333 | 0 |
| 0.7590277777777777 | 0 |
| 0.7597222222222223 | 0 |
| 0.7604166666666666 | 0 |
| 0.7611111111111111 | 0 |
| 0.7618055555555556 | 0 |
| 0.7625000000000001 | 0 |
| 0.7631944444444444 | 0 |
| 0.7638888888888888 | 0 |
| 0.7645833333333334 | 0 |
| 0.7652777777777778 | 0 |
| 0.7659722222222222 | 0 |
| 0.7666666666666666 | 0 |
| 0.7673611111111112 | 0 |
| 0.7680555555555556 | 0 |
| 0.7687499999999999 | 0 |
| 0.7694444444444444 | 0 |
| 0.7701388888888889 | 0 |
| 0.7708333333333334 | 0 |
| 0.7715277777777777 | 0 |
| 0.7722222222222223 | 0 |
| 0.7729166666666667 | 0 |
| 0.7736111111111111 | 0 |
| 0.7743055555555555 | 0 |
| 0.775 | 0 |
| 0.7756944444444445 | 0 |
| 0.7763888888888889 | 0 |
| 0.7770833333333332 | 0 |
| 0.7777777777777778 | 0 |
| 0.7784722222222222 | 0 |
| 0.7791666666666667 | 0 |
| 0.779861111111111 | 0 |
| 0.7805555555555556 | 0 |
| 0.78125 | 0 |
| 0.7819444444444444 | 0 |
| 0.782638888888889 | 0 |
| 0.7833333333333333 | 0 |
| 0.7840277777777778 | 0 |
| 0.7847222222222222 | 0 |
| 0.7854166666666668 | 0 |
| 0.7861111111111111 | 0 |
| 0.7868055555555555 | 0 |
| 0.7875 | 0 |
| 0.7881944444444445 | 0 |
| 0.7888888888888889 | 0 |
| 0.7895833333333333 | 0 |
| 0.7902777777777777 | 0 |
| 0.7909722222222223 | 0 |
| 0.7916666666666666 | 0 |
| 0.7923611111111111 | 0 |
| 0.7930555555555556 | 0 |
| 0.7937500000000001 | 0 |
| 0.7944444444444444 | 0 |
| 0.7951388888888888 | 0 |
| 0.7958333333333334 | 0 |
| 0.7965277777777778 | 0 |
| 0.7972222222222222 | 0 |
| 0.7979166666666666 | 0 |
| 0.7986111111111112 | 0 |
| 0.7993055555555556 | 0 |
| 0.7999999999999999 | 0 |
| 0.8006944444444444 | 0 |
| 0.8013888888888889 | 0 |
| 0.8020833333333334 | 0 |
| 0.8027777777777777 | 0 |
| 0.8034722222222223 | 0 |
| 0.8041666666666667 | 0 |
| 0.8048611111111111 | 0 |
| 0.8055555555555555 | 0 |
| 0.80625 | 0 |
| 0.8069444444444445 | 0 |
| 0.8076388888888889 | 0 |
| 0.8083333333333332 | 0 |
| 0.8090277777777778 | 0 |
| 0.8097222222222222 | 0 |
| 0.8104166666666667 | 0 |
| 0.811111111111111 | 0 |
| 0.8118055555555556 | 0 |
| 0.8125 | 0 |
| 0.8131944444444444 | 0 |
| 0.813888888888889 | 0 |
| 0.8145833333333333 | 0 |
| 0.8152777777777778 | 0 |
| 0.8159722222222222 | 0 |
| 0.8166666666666668 | 0 |
| 0.8173611111111111 | 0 |
| 0.8180555555555555 | 0 |
| 0.81875 | 0 |
| 0.8194444444444445 | 0 |
| 0.8201388888888889 | 0 |
| 0.8208333333333333 | 0 |
| 0.8215277777777777 | 0 |
| 0.8222222222222223 | 0 |
| 0.8229166666666666 | 0 |
| 0.8236111111111111 | 0 |
| 0.8243055555555556 | 0 |
| 0.8250000000000001 | 0 |
| 0.8256944444444444 | 0 |
| 0.8263888888888888 | 0 |
| 0.8270833333333334 | 0 |
| 0.8277777777777778 | 0 |
| 0.8284722222222222 | 0 |
| 0.8291666666666666 | 0 |
| 0.8298611111111112 | 0 |
| 0.8305555555555556 | 0 |
| 0.8312499999999999 | 0 |
| 0.8319444444444444 | 0 |
| 0.8326388888888889 | 0 |
| 0.8333333333333334 | 0 |
| 0.8340277777777777 | 0 |
| 0.8347222222222223 | 0 |
| 0.8354166666666667 | 0 |
| 0.8361111111111111 | 0 |
| 0.8368055555555555 | 0 |
| 0.8375 | 0 |
| 0.8381944444444445 | 0 |
| 0.8388888888888889 | 0 |
| 0.8395833333333332 | 0 |
| 0.8402777777777778 | 0 |
| 0.8409722222222222 | 0 |
| 0.8416666666666667 | 0 |
| 0.842361111111111 | 0 |
| 0.8430555555555556 | 0 |
| 0.84375 | 0 |
| 0.8444444444444444 | 0 |
| 0.845138888888889 | 0 |
| 0.8458333333333333 | 0 |
| 0.8465277777777778 | 0 |
| 0.8472222222222222 | 0 |
| 0.8479166666666668 | 0 |
| 0.8486111111111111 | 0 |
| 0.8493055555555555 | 0 |
| 0.85 | 0 |
| 0.8506944444444445 | 0 |
| 0.8513888888888889 | 0 |
| 0.8520833333333333 | 0 |
| 0.8527777777777777 | 0 |
| 0.8534722222222223 | 0 |
| 0.8541666666666666 | 0 |
| 0.8548611111111111 | 0 |
| 0.8555555555555556 | 0 |
| 0.8562500000000001 | 0 |
| 0.8569444444444444 | 0 |
| 0.8576388888888888 | 0 |
| 0.8583333333333334 | 0 |
| 0.8590277777777778 | 0 |
| 0.8597222222222222 | 0 |
| 0.8604166666666666 | 0 |
| 0.8611111111111112 | 0 |
| 0.8618055555555556 | 0 |
| 0.8624999999999999 | 0 |
| 0.8631944444444444 | 0 |
| 0.8638888888888889 | 0 |
| 0.8645833333333334 | 0 |
| 0.8652777777777777 | 0 |
| 0.8659722222222223 | 0 |
| 0.8666666666666667 | 0 |
| 0.8673611111111111 | 0 |
| 0.8680555555555555 | 0 |
| 0.86875 | 0 |
| 0.8694444444444445 | 0 |
| 0.8701388888888889 | 0 |
| 0.8708333333333332 | 0 |
| 0.8715277777777778 | 0 |
| 0.8722222222222222 | 0 |
| 0.8729166666666667 | 0 |
| 0.873611111111111 | 0 |
| 0.8743055555555556 | 0 |
| 0.875 | 0 |
| 0.8756944444444444 | 0 |
| 0.876388888888889 | 0 |
| 0.8770833333333333 | 0 |
| 0.8777777777777778 | 0 |
| 0.8784722222222222 | 0 |
| 0.8791666666666668 | 0 |
| 0.8798611111111111 | 0 |
| 0.8805555555555555 | 0 |
| 0.88125 | 0 |
| 0.8819444444444445 | 0 |
| 0.8826388888888889 | 0 |
| 0.8833333333333333 | 0 |
| 0.8840277777777777 | 0 |
| 0.8847222222222223 | 0 |
| 0.8854166666666666 | 0 |
| 0.8861111111111111 | 0 |
| 0.8868055555555556 | 0 |
| 0.8875000000000001 | 0 |
| 0.8881944444444444 | 0 |
| 0.8888888888888888 | 0 |
| 0.8895833333333334 | 0 |
| 0.8902777777777778 | 0 |
| 0.8909722222222222 | 0 |
| 0.8916666666666666 | 0 |
| 0.8923611111111112 | 0 |
| 0.8930555555555556 | 0 |
| 0.8937499999999999 | 0 |
| 0.8944444444444444 | 0 |
| 0.8951388888888889 | 0 |
| 0.8958333333333334 | 0 |
| 0.8965277777777777 | 0 |
| 0.8972222222222223 | 0 |
| 0.8979166666666667 | 0 |
| 0.8986111111111111 | 0 |
| 0.8993055555555555 | 0 |
| 0.9 | 0 |
| 0.9006944444444445 | 0 |
| 0.9013888888888889 | 0 |
| 0.9020833333333332 | 0 |
| 0.9027777777777778 | 0 |
| 0.9034722222222222 | 0 |
| 0.9041666666666667 | 0 |
| 0.904861111111111 | 0 |
| 0.9055555555555556 | 0 |
| 0.90625 | 0 |
| 0.9069444444444444 | 0 |
| 0.907638888888889 | 0 |
| 0.9083333333333333 | 0 |
| 0.9090277777777778 | 0 |
| 0.9097222222222222 | 0 |
| 0.9104166666666668 | 0 |
| 0.9111111111111111 | 0 |
| 0.9118055555555555 | 0 |
| 0.9125 | 0 |
| 0.9131944444444445 | 0 |
| 0.9138888888888889 | 0 |
| 0.9145833333333333 | 0 |
| 0.9152777777777777 | 0 |
| 0.9159722222222223 | 0 |
| 0.9166666666666666 | 0 |
| 0.9173611111111111 | 0 |
| 0.9180555555555556 | 0 |
| 0.9187500000000001 | 0 |
| 0.9194444444444444 | 0 |
| 0.9201388888888888 | 0 |
| 0.9208333333333334 | 0 |
| 0.9215277777777778 | 0 |
| 0.9222222222222222 | 0 |
| 0.9229166666666666 | 0 |
| 0.9236111111111112 | 0 |
| 0.9243055555555556 | 0 |
| 0.9249999999999999 | 0 |
| 0.9256944444444444 | 0 |
| 0.9263888888888889 | 0 |
| 0.9270833333333334 | 0 |
| 0.9277777777777777 | 0 |
| 0.9284722222222223 | 0 |
| 0.9291666666666667 | 0 |
| 0.9298611111111111 | 0 |
| 0.9305555555555555 | 0 |
| 0.93125 | 0 |
| 0.9319444444444445 | 0 |
| 0.9326388888888889 | 0 |
| 0.9333333333333332 | 0 |
| 0.9340277777777778 | 0 |
| 0.9347222222222222 | 0 |
| 0.9354166666666667 | 0 |
| 0.936111111111111 | 0 |
| 0.9368055555555556 | 0 |
| 0.9375 | 0 |
| 0.9381944444444444 | 0 |
| 0.938888888888889 | 0 |
| 0.9395833333333333 | 0 |
| 0.9402777777777778 | 0 |
| 0.9409722222222222 | 0 |
| 0.9416666666666668 | 0 |
| 0.9423611111111111 | 0 |
| 0.9430555555555555 | 0 |
| 0.94375 | 0 |
| 0.9444444444444445 | 0 |
| 0.9451388888888889 | 0 |
| 0.9458333333333333 | 0 |
| 0.9465277777777777 | 0 |
| 0.9472222222222223 | 0 |
| 0.9479166666666666 | 0 |
| 0.9486111111111111 | 0 |
| 0.9493055555555556 | 0 |
| 0.9500000000000001 | 0 |
| 0.9506944444444444 | 0 |
| 0.9513888888888888 | 0 |
| 0.9520833333333334 | 0 |
| 0.9527777777777778 | 0 |
| 0.9534722222222222 | 0 |
| 0.9541666666666666 | 0 |
| 0.9548611111111112 | 0 |
| 0.9555555555555556 | 0 |
| 0.9562499999999999 | 0 |
| 0.9569444444444444 | 0 |
| 0.9576388888888889 | 0 |
| 0.9583333333333334 | 0 |
| 0.9590277777777777 | 0 |
| 0.9597222222222223 | 0 |
| 0.9604166666666667 | 0 |
| 0.9611111111111111 | 0 |
| 0.9618055555555555 | 0 |
| 0.9625 | 0 |
| 0.9631944444444445 | 0 |
| 0.9638888888888889 | 0 |
| 0.9645833333333332 | 0 |
| 0.9652777777777778 | 0 |
| 0.9659722222222222 | 0 |
| 0.9666666666666667 | 0 |
| 0.967361111111111 | 0 |
| 0.9680555555555556 | 0 |
| 0.96875 | 0 |
| 0.9694444444444444 | 0 |
| 0.970138888888889 | 0 |
| 0.9708333333333333 | 0 |
| 0.9715277777777778 | 0 |
| 0.9722222222222222 | 0 |
| 0.9729166666666668 | 0 |
| 0.9736111111111111 | 0 |
| 0.9743055555555555 | 0 |
| 0.975 | 0 |
| 0.9756944444444445 | 0 |
| 0.9763888888888889 | 0 |
| 0.9770833333333333 | 0 |
| 0.9777777777777777 | 0 |
| 0.9784722222222223 | 0 |
| 0.9791666666666666 | 0 |
| 0.9798611111111111 | 0 |
| 0.9805555555555556 | 0 |
| 0.9812500000000001 | 0 |
| 0.9819444444444444 | 0 |
| 0.9826388888888888 | 0 |
| 0.9833333333333334 | 0 |
| 0.9840277777777778 | 0 |
| 0.9847222222222222 | 0 |
| 0.9854166666666666 | 0 |
| 0.9861111111111112 | 0 |
| 0.9868055555555556 | 0 |
| 0.9874999999999999 | 0 |
| 0.9881944444444444 | 0 |
| 0.9888888888888889 | 0 |
| 0.9895833333333334 | 0 |
| 0.9902777777777777 | 0 |
| 0.9909722222222223 | 0 |
| 0.9916666666666667 | 0 |
| 0.9923611111111111 | 0 |
| 0.9930555555555555 | 0 |
| 0.99375 | 0 |
| 0.9944444444444445 | 0 |
| 0.9951388888888889 | 0 |
| 0.9958333333333332 | 0 |
| 0.9965277777777778 | 0 |
| 0.9972222222222222 | 0 |
| 0.9979166666666667 | 0 |
| 0.998611111111111 | 0 |
| 0.9993055555555556 | 0 |